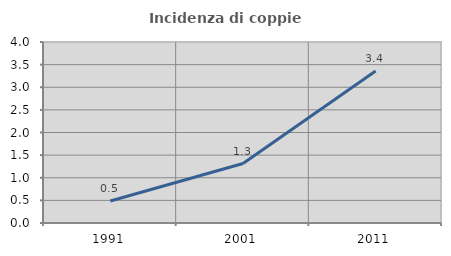
| Category | Incidenza di coppie miste |
|---|---|
| 1991.0 | 0.486 |
| 2001.0 | 1.315 |
| 2011.0 | 3.361 |